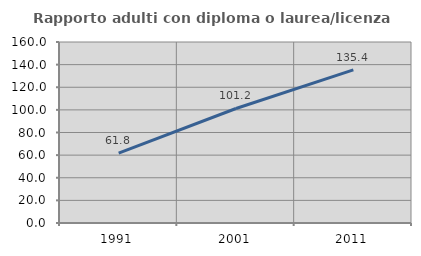
| Category | Rapporto adulti con diploma o laurea/licenza media  |
|---|---|
| 1991.0 | 61.818 |
| 2001.0 | 101.216 |
| 2011.0 | 135.381 |